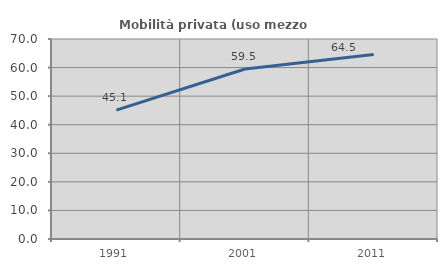
| Category | Mobilità privata (uso mezzo privato) |
|---|---|
| 1991.0 | 45.115 |
| 2001.0 | 59.511 |
| 2011.0 | 64.539 |